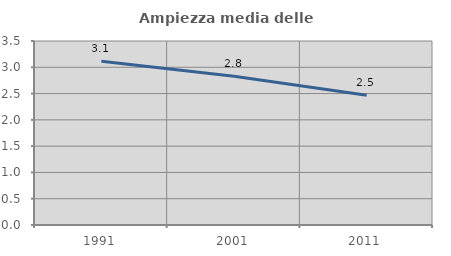
| Category | Ampiezza media delle famiglie |
|---|---|
| 1991.0 | 3.116 |
| 2001.0 | 2.829 |
| 2011.0 | 2.469 |